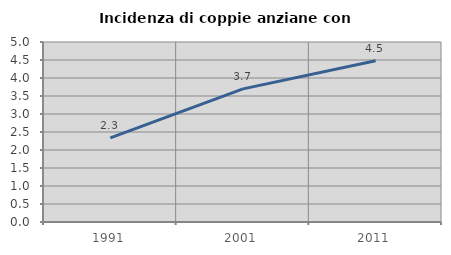
| Category | Incidenza di coppie anziane con figli |
|---|---|
| 1991.0 | 2.338 |
| 2001.0 | 3.697 |
| 2011.0 | 4.481 |